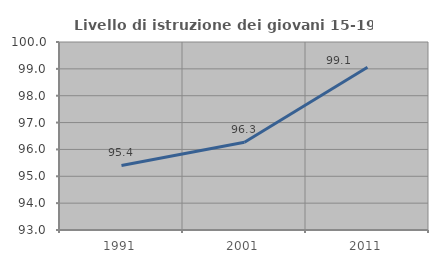
| Category | Livello di istruzione dei giovani 15-19 anni |
|---|---|
| 1991.0 | 95.402 |
| 2001.0 | 96.269 |
| 2011.0 | 99.057 |